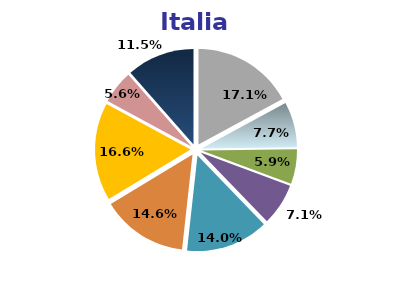
| Category | Italia |
|---|---|
| Agricoltura | 17.1 |
| Industria in senso stretto | 7.7 |
| Costruzioni | 5.9 |
| Commercio e riparazioni | 7.1 |
| Alberghi e ristoranti | 14 |
| Trasporti, comunicazioni etc. | 14.6 |
| P.A., istruzione e sanità | 16.6 |
| Attività svolte da famiglie e convivenze | 5.6 |
| Altri servizi pubblici, sociali e personali | 11.5 |